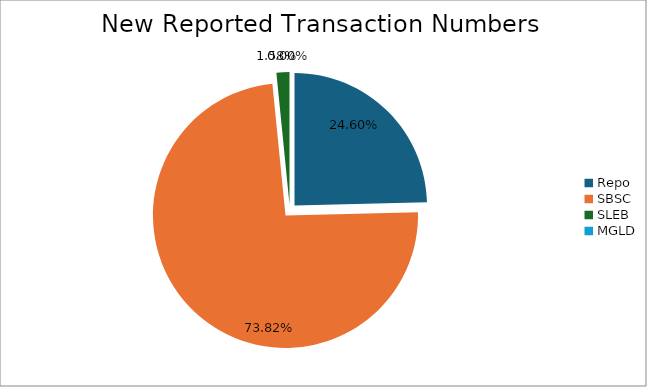
| Category | Series 0 |
|---|---|
| Repo | 1028 |
| SBSC | 3085 |
| SLEB | 66 |
| MGLD | 0 |